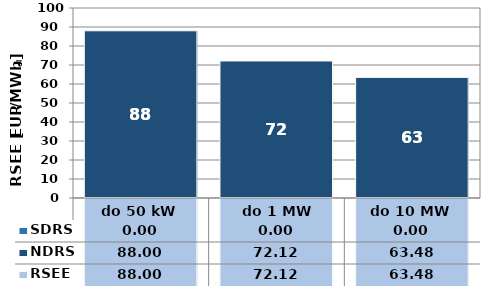
| Category | NDRS | SDRS |
|---|---|---|
| do 50 kW | 88 | 0 |
|  do 1 MW | 72.12 | 0 |
| do 10 MW | 63.48 | 0 |